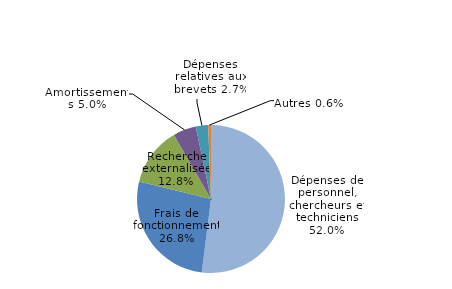
| Category | Series 0 |
|---|---|
| Dépenses de personnel, chercheurs et techniciens | 0.52 |
| Frais de fonctionnement | 0.268 |
| Recherche externalisée | 0.128 |
| Amortissements | 0.05 |
| Dépenses relatives aux brevets | 0.027 |
| Autres | 0.006 |